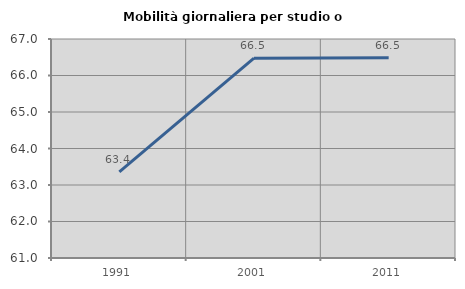
| Category | Mobilità giornaliera per studio o lavoro |
|---|---|
| 1991.0 | 63.362 |
| 2001.0 | 66.476 |
| 2011.0 | 66.485 |